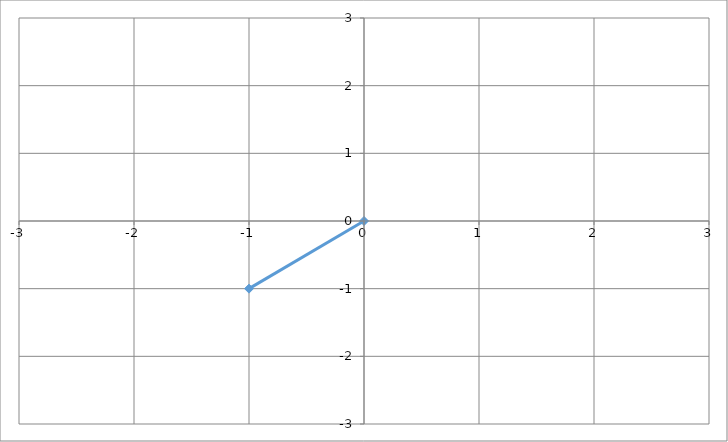
| Category | Series 0 |
|---|---|
| 0.0 | 0 |
| -1.0 | -1 |